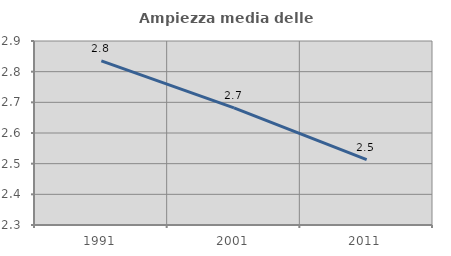
| Category | Ampiezza media delle famiglie |
|---|---|
| 1991.0 | 2.835 |
| 2001.0 | 2.682 |
| 2011.0 | 2.513 |